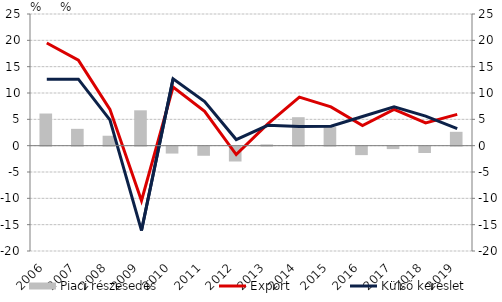
| Category | Piaci részesedés |
|---|---|
| 2006.0 | 6.105 |
| 2007.0 | 3.196 |
| 2008.0 | 1.885 |
| 2009.0 | 6.713 |
| 2010.0 | -1.308 |
| 2011.0 | -1.728 |
| 2012.0 | -2.817 |
| 2013.0 | 0.241 |
| 2014.0 | 5.407 |
| 2015.0 | 3.529 |
| 2016.0 | -1.605 |
| 2017.0 | -0.463 |
| 2018.0 | -1.203 |
| 2019.0 | 2.629 |